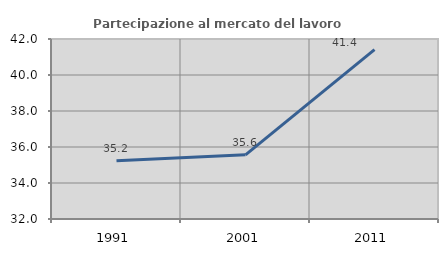
| Category | Partecipazione al mercato del lavoro  femminile |
|---|---|
| 1991.0 | 35.234 |
| 2001.0 | 35.565 |
| 2011.0 | 41.407 |